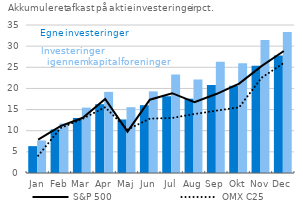
| Category | F&P's egne aktieinvesteringer | F&P's aktieinvesteringer igennem kapitalforeninger |
|---|---|---|
| Jan | 6.353 | 7.69 |
| Feb | 10.3 | 11.713 |
| Mar | 13.022 | 15.456 |
| Apr | 16.274 | 19.18 |
| Maj | 12.659 | 15.567 |
| Jun | 16.039 | 19.299 |
| Jul | 18.149 | 23.276 |
| Aug | 17.58 | 22.097 |
| Sep | 20.804 | 26.317 |
| Okt | 20.618 | 25.934 |
| Nov | 25.375 | 31.461 |
| Dec | 27.763 | 33.345 |